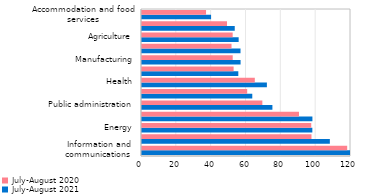
| Category | July-August 2021 | July-August 2020 |
|---|---|---|
| Information and communications  | 133.152 | 117.807 |
| Financial sector | 107.854 | 97.308 |
| Energy | 97.805 | 97.178 |
| Mining | 97.844 | 90.132 |
| Public administration | 74.874 | 69.105 |
| Education | 63.319 | 60.394 |
| Health | 71.704 | 64.777 |
| Transport and storage  | 55.3 | 52.602 |
| Manufacturing | 56.606 | 52.089 |
| Construction | 56.56 | 51.4 |
| Agriculture | 55.495 | 52.064 |
| Trade | 53.251 | 48.812 |
| Accommodation and food services | 39.656 | 36.774 |